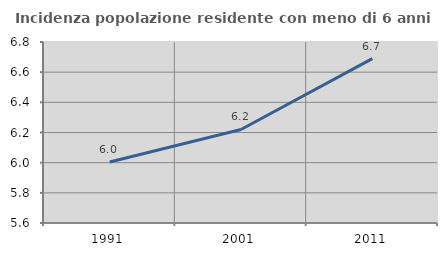
| Category | Incidenza popolazione residente con meno di 6 anni |
|---|---|
| 1991.0 | 6.005 |
| 2001.0 | 6.22 |
| 2011.0 | 6.69 |